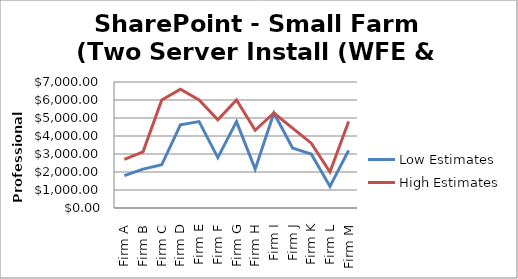
| Category | Low Estimates | High Estimates |
|---|---|---|
| Firm A | 1800 | 2700 |
| Firm B | 2160 | 3120 |
| Firm C | 2400 | 6000 |
| Firm D | 4620 | 6600 |
| Firm E | 4800 | 6000 |
| Firm F | 2800 | 4900 |
| Firm G | 4800 | 6000 |
| Firm H | 2160 | 4320 |
| Firm I | 5280 | 5280 |
| Firm J | 3330 | 4440 |
| Firm K | 3000 | 3600 |
| Firm L | 1200 | 2000 |
| Firm M | 3200 | 4800 |